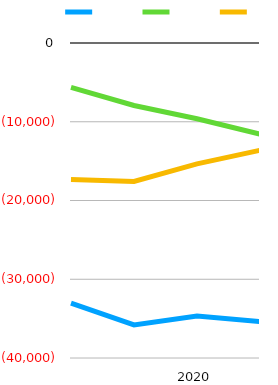
| Category | Series 0 | Series 1 | Series 2 |
|---|---|---|---|
|  | -33021 | -5638.35 | -17336 |
|  | -35791 | -7938.54 | -17575 |
| 2020 | -34672 | -9626.39 | -15354 |
|  | -35388 | -11563.74 | -13615 |